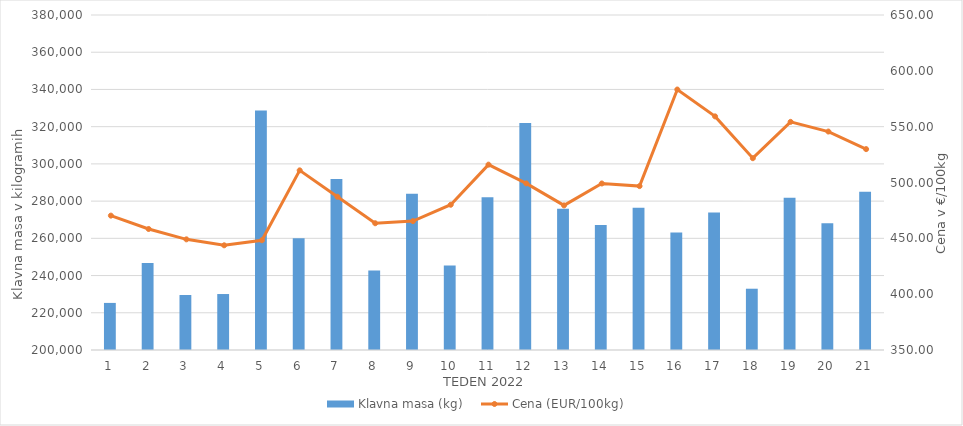
| Category | Klavna masa (kg) |
|---|---|
| 1.0 | 225300 |
| 2.0 | 246712 |
| 3.0 | 229541 |
| 4.0 | 230074 |
| 5.0 | 328640 |
| 6.0 | 260108 |
| 7.0 | 291887 |
| 8.0 | 242732 |
| 9.0 | 283987 |
| 10.0 | 245414 |
| 11.0 | 282092 |
| 12.0 | 321936 |
| 13.0 | 275950 |
| 14.0 | 267148 |
| 15.0 | 276417 |
| 16.0 | 263098 |
| 17.0 | 273824 |
| 18.0 | 232926 |
| 19.0 | 281859 |
| 20.0 | 268153 |
| 21.0 | 285073 |